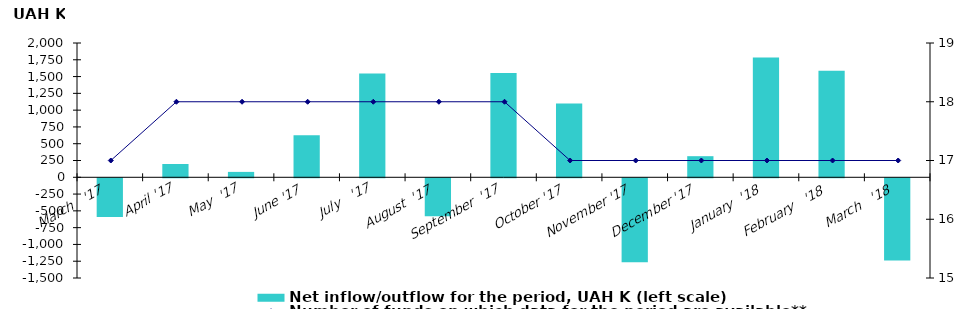
| Category | Net inflow/outflow for the period, UAH K (left scale) |
|---|---|
| March   '17 | -576.733 |
| April '17 | 197.722 |
| May  '17 | 80.282 |
| June '17 | 625.568 |
| July   '17 | 1545.994 |
| August  '17 | -564.222 |
| September  '17 | 1554.716 |
| October '17 | 1098.918 |
| November '17 | -1250.645 |
| December '17 | 314.249 |
| January  '18 | 1782.967 |
| February   '18 | 1586.636 |
| March   '18 | -1224.388 |